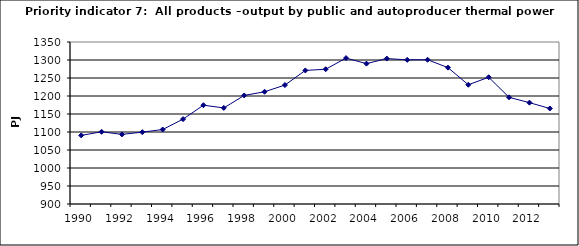
| Category | All products –output by public and autoproducer thermal power stations, PJ |
|---|---|
| 1990 | 1090.57 |
| 1991 | 1100.534 |
| 1992 | 1093.374 |
| 1993 | 1099.559 |
| 1994 | 1106.914 |
| 1995 | 1135.836 |
| 1996 | 1174.446 |
| 1997 | 1166.879 |
| 1998 | 1201.55 |
| 1999 | 1211.789 |
| 2000 | 1230.419 |
| 2001 | 1271.005 |
| 2002 | 1274.377 |
| 2003 | 1305.361 |
| 2004 | 1289.928 |
| 2005 | 1303.964 |
| 2006 | 1300.435 |
| 2007 | 1300.742 |
| 2008 | 1278.86 |
| 2009 | 1231.239 |
| 2010 | 1252.027 |
| 2011 | 1196.323 |
| 2012 | 1181.489 |
| 2013 | 1165.336 |